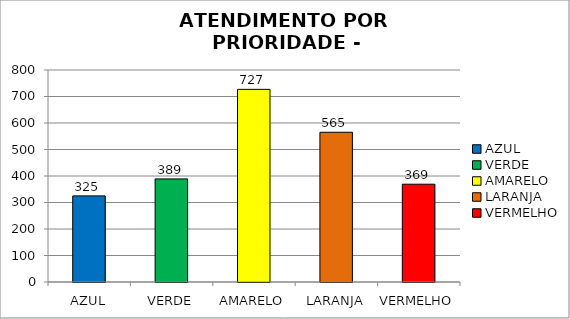
| Category | Total Regional: |
|---|---|
| AZUL | 325 |
| VERDE | 389 |
| AMARELO | 727 |
| LARANJA | 565 |
| VERMELHO | 369 |